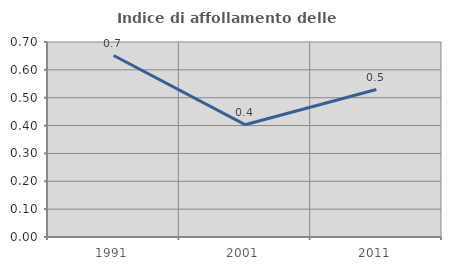
| Category | Indice di affollamento delle abitazioni  |
|---|---|
| 1991.0 | 0.651 |
| 2001.0 | 0.403 |
| 2011.0 | 0.529 |